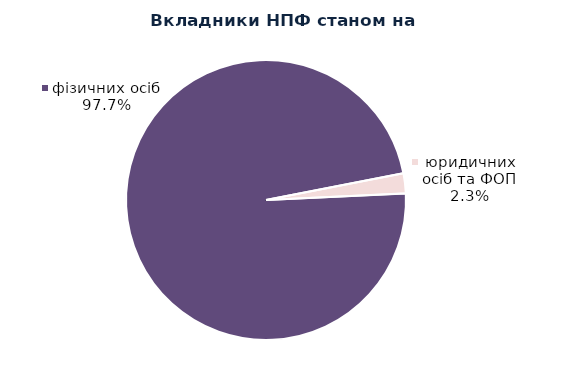
| Category | Series 0 |
|---|---|
| юридичних осіб та ФОП | 1989 |
| фізичних осіб | 84282 |